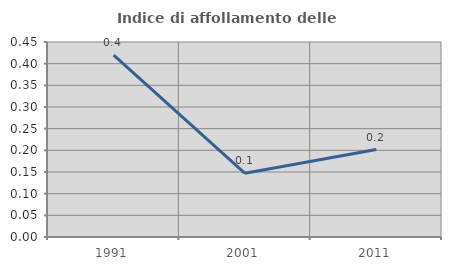
| Category | Indice di affollamento delle abitazioni  |
|---|---|
| 1991.0 | 0.42 |
| 2001.0 | 0.147 |
| 2011.0 | 0.202 |